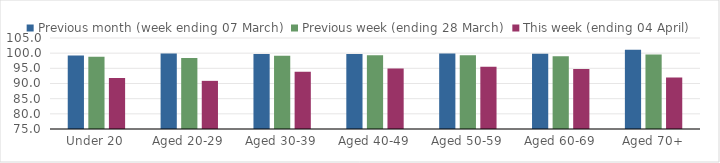
| Category | Previous month (week ending 07 March) | Previous week (ending 28 March) | This week (ending 04 April) |
|---|---|---|---|
| Under 20 | 99.264 | 98.799 | 91.829 |
| Aged 20-29 | 99.881 | 98.371 | 90.871 |
| Aged 30-39 | 99.726 | 99.121 | 93.899 |
| Aged 40-49 | 99.713 | 99.308 | 94.978 |
| Aged 50-59 | 99.879 | 99.346 | 95.505 |
| Aged 60-69 | 99.837 | 99.008 | 94.778 |
| Aged 70+ | 101.098 | 99.535 | 91.938 |